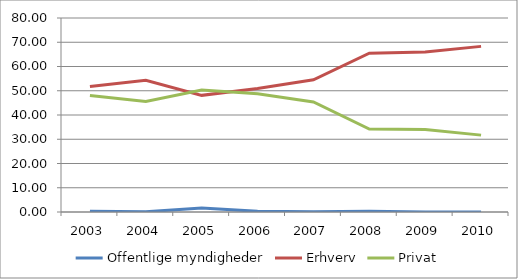
| Category | Offentlige myndigheder | Erhverv | Privat |
|---|---|---|---|
| 2003.0 | 0.26 | 51.73 | 48.01 |
| 2004.0 | 0.12 | 54.31 | 45.57 |
| 2005.0 | 1.6 | 48.1 | 50.3 |
| 2006.0 | 0.3 | 50.9 | 48.8 |
| 2007.0 | 0.1 | 54.5 | 45.4 |
| 2008.0 | 0.3 | 65.5 | 34.2 |
| 2009.0 | 0 | 66 | 34 |
| 2010.0 | 0 | 68.3 | 31.7 |